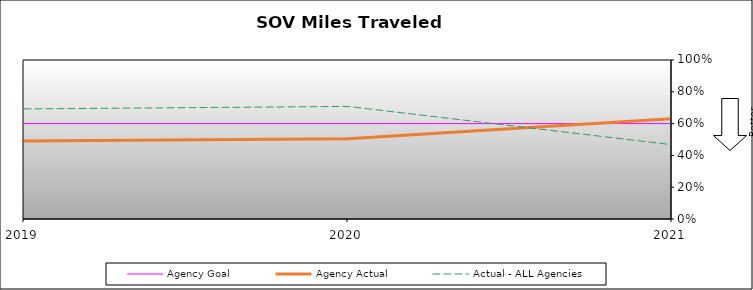
| Category | Agency Goal | Agency Actual | Actual - ALL Agencies |
|---|---|---|---|
| 2019.0 | 0.6 | 0.49 | 0.692 |
| 2020.0 | 0.6 | 0.505 | 0.708 |
| 2021.0 | 0.6 | 0.632 | 0.467 |